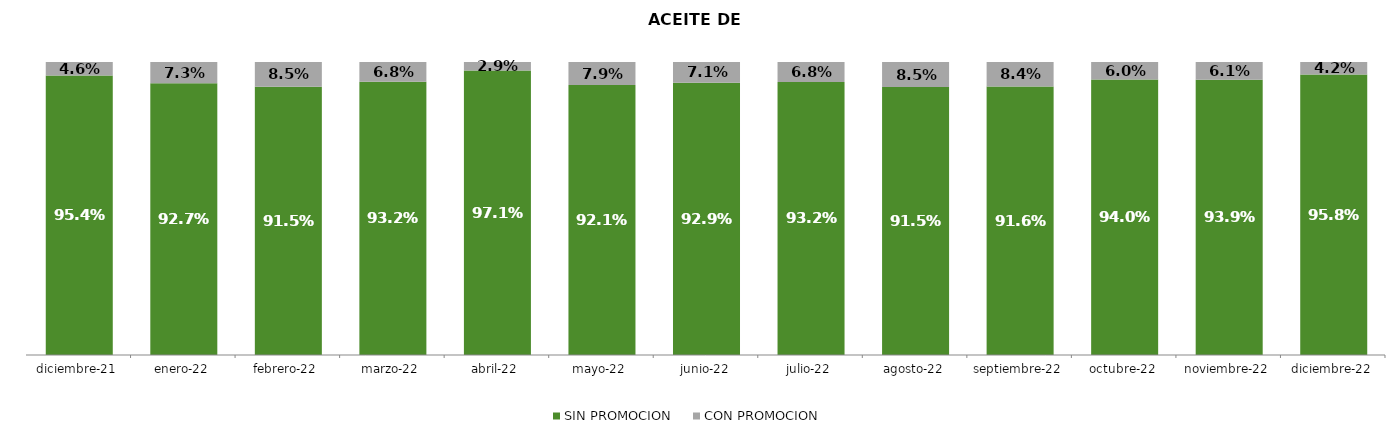
| Category | SIN PROMOCION   | CON PROMOCION   |
|---|---|---|
| 2021-12-01 | 0.954 | 0.046 |
| 2022-01-01 | 0.927 | 0.073 |
| 2022-02-01 | 0.915 | 0.085 |
| 2022-03-01 | 0.932 | 0.068 |
| 2022-04-01 | 0.971 | 0.029 |
| 2022-05-01 | 0.921 | 0.079 |
| 2022-06-01 | 0.929 | 0.071 |
| 2022-07-01 | 0.932 | 0.068 |
| 2022-08-01 | 0.915 | 0.085 |
| 2022-09-01 | 0.916 | 0.084 |
| 2022-10-01 | 0.94 | 0.06 |
| 2022-11-01 | 0.939 | 0.061 |
| 2022-12-01 | 0.958 | 0.042 |